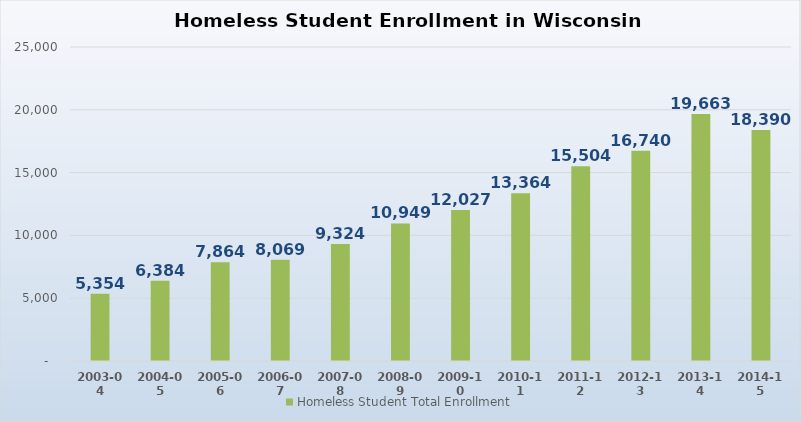
| Category | Homeless Student Total Enrollment |
|---|---|
| 2003-04 | 5354 |
| 2004-05 | 6384 |
| 2005-06 | 7864 |
| 2006-07 | 8069 |
| 2007-08 | 9324 |
| 2008-09 | 10949 |
| 2009-10 | 12027 |
| 2010-11 | 13364 |
| 2011-12 | 15504 |
| 2012-13 | 16740 |
| 2013-14 | 19663 |
| 2014-15 | 18390 |